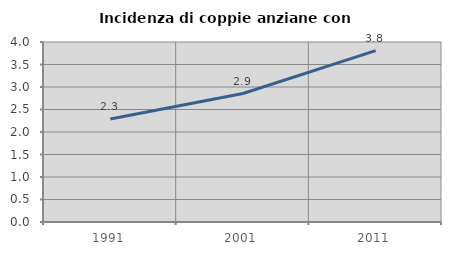
| Category | Incidenza di coppie anziane con figli |
|---|---|
| 1991.0 | 2.29 |
| 2001.0 | 2.855 |
| 2011.0 | 3.807 |